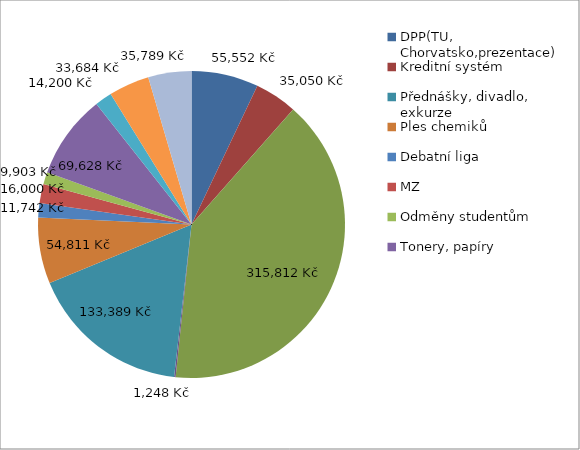
| Category | Series 0 |
|---|---|
| DPP(TU, Chorvatsko,prezentace) | 55552 |
| Kreditní systém | 35050 |
|  | 315812 |
|  | 1248 |
| Přednášky, divadlo, exkurze  | 133389 |
| Ples chemiků  | 54811 |
| Debatní liga | 11742 |
| MZ | 16000 |
| Odměny studentům | 9903 |
| Tonery, papíry  | 69628 |